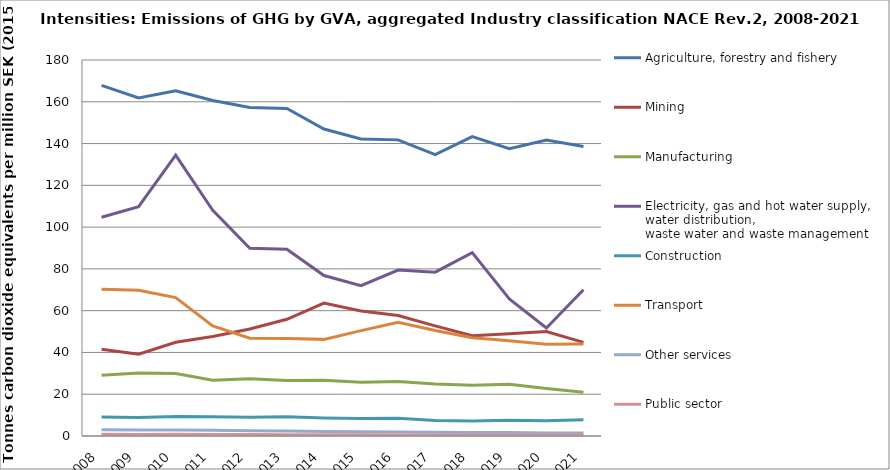
| Category | Agriculture, forestry and fishery | Mining | Manufacturing | Electricity, gas and hot water supply, water distribution, 
waste water and waste management | Construction | Transport | Other services | Public sector |
|---|---|---|---|---|---|---|---|---|
| 2008 | 167.835 | 41.48 | 29.067 | 104.72 | 9.104 | 70.199 | 2.997 | 0.807 |
| 2009 | 161.824 | 39.125 | 30.146 | 109.822 | 8.826 | 69.807 | 2.856 | 0.759 |
| 2010 | 165.296 | 44.891 | 29.947 | 134.478 | 9.385 | 66.235 | 2.851 | 0.78 |
| 2011 | 160.605 | 47.658 | 26.689 | 108.069 | 9.205 | 52.699 | 2.734 | 0.699 |
| 2012 | 157.299 | 51.24 | 27.385 | 89.888 | 9.009 | 46.801 | 2.498 | 0.707 |
| 2013 | 156.83 | 55.885 | 26.619 | 89.375 | 9.234 | 46.725 | 2.364 | 0.617 |
| 2014 | 146.966 | 63.653 | 26.688 | 76.805 | 8.653 | 46.259 | 2.129 | 0.575 |
| 2015 | 142.165 | 59.87 | 25.77 | 71.954 | 8.36 | 50.428 | 2.008 | 0.561 |
| 2016 | 141.765 | 57.64 | 26.095 | 79.458 | 8.509 | 54.425 | 1.893 | 0.539 |
| 2017 | 134.684 | 52.735 | 24.841 | 78.417 | 7.429 | 50.472 | 1.809 | 0.51 |
| 2018 | 143.326 | 48.006 | 24.286 | 87.758 | 7.159 | 47.004 | 1.726 | 0.494 |
| 2019 | 137.502 | 48.938 | 24.768 | 65.596 | 7.513 | 45.626 | 1.668 | 0.528 |
| 2020 | 141.688 | 50.02 | 22.733 | 51.697 | 7.279 | 43.969 | 1.46 | 0.53 |
| 2021 | 138.629 | 44.792 | 20.978 | 70.022 | 7.796 | 43.995 | 1.414 | 0.509 |